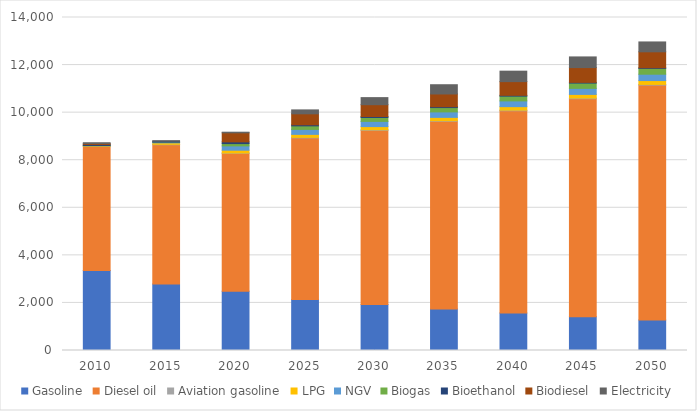
| Category | Gasoline | Diesel oil | Aviation gasoline | LPG | NGV | Biogas | Bioethanol | Biodiesel | Electricity |
|---|---|---|---|---|---|---|---|---|---|
| 2010.0 | 3365.722 | 5210.222 | 11.11 | 26.111 | 0.556 | 0.556 | 46.52 | 37.778 | 37.056 |
| 2015.0 | 2798.889 | 5851.5 | 16.524 | 63.283 | 32.222 | 0.556 | 34.89 | 0 | 23 |
| 2020.0 | 2493.333 | 5796.111 | 13.889 | 117.5 | 180.833 | 97.5 | 71.944 | 380.833 | 25.833 |
| 2025.0 | 2139.322 | 6798.783 | 22.546 | 126.318 | 208.121 | 148.893 | 45.294 | 461.194 | 165.066 |
| 2030.0 | 1930.82 | 7326.025 | 23.697 | 132.761 | 218.737 | 164.47 | 40.88 | 496.96 | 297.183 |
| 2035.0 | 1742.638 | 7894.153 | 24.905 | 139.533 | 229.895 | 181.678 | 36.896 | 535.499 | 388.65 |
| 2040.0 | 1572.798 | 8506.34 | 26.176 | 146.651 | 241.622 | 200.685 | 33.3 | 577.026 | 439.229 |
| 2045.0 | 1419.51 | 9166.001 | 27.511 | 154.132 | 253.947 | 221.681 | 30.054 | 621.774 | 448.269 |
| 2050.0 | 1281.162 | 9876.819 | 28.914 | 161.994 | 266.901 | 244.874 | 27.125 | 669.992 | 414.709 |